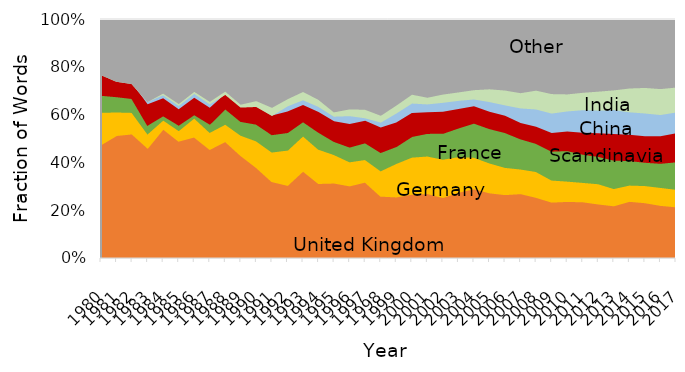
| Category | UK | Germany | France | Scandinavia | China | India | Italy | Rest of Europe | Other |
|---|---|---|---|---|---|---|---|---|---|
| 1980.0 | 0.041 | 0.012 | 0.006 | 0.007 | 0 | 0 | 0.002 | 0.018 | 0 |
| 1981.0 | 0.061 | 0.012 | 0.008 | 0.008 | 0 | 0 | 0.002 | 0.024 | 0.005 |
| 1982.0 | 0.071 | 0.012 | 0.008 | 0.009 | 0 | 0 | 0.003 | 0.025 | 0.009 |
| 1983.0 | 0.081 | 0.011 | 0.006 | 0.015 | 0.003 | 0 | 0.011 | 0.033 | 0.017 |
| 1984.0 | 0.081 | 0.006 | 0.003 | 0.011 | 0.003 | 0.001 | 0.009 | 0.021 | 0.017 |
| 1985.0 | 0.067 | 0.006 | 0.003 | 0.009 | 0.003 | 0.001 | 0.009 | 0.022 | 0.017 |
| 1986.0 | 0.063 | 0.01 | 0.002 | 0.008 | 0.003 | 0.001 | 0.009 | 0.016 | 0.012 |
| 1987.0 | 0.062 | 0.01 | 0.005 | 0.009 | 0.003 | 0.001 | 0.017 | 0.018 | 0.012 |
| 1988.0 | 0.055 | 0.008 | 0.007 | 0.007 | 0 | 0.002 | 0.01 | 0.02 | 0.004 |
| 1989.0 | 0.056 | 0.011 | 0.008 | 0.008 | 0 | 0.002 | 0.01 | 0.027 | 0.009 |
| 1990.0 | 0.055 | 0.016 | 0.01 | 0.01 | 0 | 0.004 | 0.01 | 0.03 | 0.009 |
| 1991.0 | 0.051 | 0.02 | 0.012 | 0.012 | 0 | 0.005 | 0.011 | 0.039 | 0.009 |
| 1992.0 | 0.051 | 0.025 | 0.012 | 0.014 | 0.004 | 0.005 | 0.004 | 0.047 | 0.005 |
| 1993.0 | 0.064 | 0.026 | 0.01 | 0.012 | 0.004 | 0.006 | 0.002 | 0.041 | 0.009 |
| 1994.0 | 0.054 | 0.024 | 0.012 | 0.014 | 0.004 | 0.005 | 0.003 | 0.046 | 0.008 |
| 1995.0 | 0.056 | 0.021 | 0.01 | 0.015 | 0.004 | 0.003 | 0.008 | 0.043 | 0.018 |
| 1996.0 | 0.055 | 0.018 | 0.011 | 0.017 | 0.007 | 0.005 | 0.009 | 0.041 | 0.018 |
| 1997.0 | 0.061 | 0.018 | 0.013 | 0.017 | 0.003 | 0.007 | 0.011 | 0.041 | 0.02 |
| 1998.0 | 0.052 | 0.021 | 0.015 | 0.02 | 0.005 | 0.006 | 0.013 | 0.05 | 0.017 |
| 1999.0 | 0.055 | 0.03 | 0.015 | 0.021 | 0.009 | 0.007 | 0.014 | 0.045 | 0.017 |
| 2000.0 | 0.058 | 0.033 | 0.019 | 0.021 | 0.009 | 0.008 | 0.011 | 0.049 | 0.007 |
| 2001.0 | 0.064 | 0.037 | 0.022 | 0.02 | 0.009 | 0.007 | 0.013 | 0.053 | 0.011 |
| 2002.0 | 0.059 | 0.037 | 0.025 | 0.02 | 0.01 | 0.008 | 0.013 | 0.051 | 0.008 |
| 2003.0 | 0.065 | 0.035 | 0.028 | 0.018 | 0.009 | 0.008 | 0.013 | 0.048 | 0.01 |
| 2004.0 | 0.069 | 0.031 | 0.034 | 0.016 | 0.008 | 0.009 | 0.011 | 0.049 | 0.009 |
| 2005.0 | 0.065 | 0.03 | 0.034 | 0.016 | 0.011 | 0.013 | 0.013 | 0.046 | 0.01 |
| 2006.0 | 0.064 | 0.027 | 0.035 | 0.016 | 0.011 | 0.015 | 0.012 | 0.048 | 0.01 |
| 2007.0 | 0.066 | 0.025 | 0.031 | 0.016 | 0.016 | 0.016 | 0.012 | 0.05 | 0.013 |
| 2008.0 | 0.063 | 0.027 | 0.029 | 0.017 | 0.019 | 0.019 | 0.011 | 0.05 | 0.012 |
| 2009.0 | 0.06 | 0.024 | 0.031 | 0.019 | 0.022 | 0.021 | 0.012 | 0.052 | 0.015 |
| 2010.0 | 0.064 | 0.023 | 0.034 | 0.021 | 0.023 | 0.019 | 0.011 | 0.058 | 0.015 |
| 2011.0 | 0.064 | 0.022 | 0.032 | 0.024 | 0.026 | 0.02 | 0.01 | 0.061 | 0.011 |
| 2012.0 | 0.064 | 0.024 | 0.032 | 0.027 | 0.027 | 0.022 | 0.008 | 0.064 | 0.012 |
| 2013.0 | 0.063 | 0.021 | 0.034 | 0.031 | 0.03 | 0.024 | 0.009 | 0.065 | 0.01 |
| 2014.0 | 0.068 | 0.019 | 0.029 | 0.03 | 0.028 | 0.028 | 0.01 | 0.066 | 0.006 |
| 2015.0 | 0.068 | 0.021 | 0.028 | 0.031 | 0.029 | 0.031 | 0.011 | 0.064 | 0.008 |
| 2016.0 | 0.066 | 0.022 | 0.03 | 0.033 | 0.028 | 0.032 | 0.011 | 0.067 | 0.008 |
| 2017.0 | 0.062 | 0.021 | 0.033 | 0.034 | 0.026 | 0.03 | 0.011 | 0.063 | 0.007 |